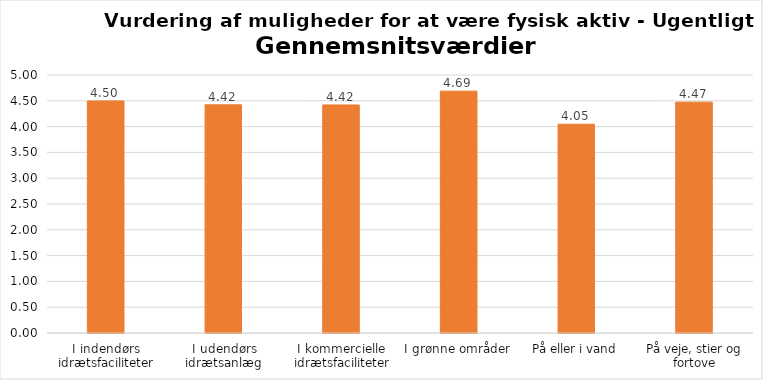
| Category | Gennemsnit |
|---|---|
| I indendørs idrætsfaciliteter | 4.497 |
| I udendørs idrætsanlæg | 4.423 |
| I kommercielle idrætsfaciliteter | 4.42 |
| I grønne områder | 4.687 |
| På eller i vand | 4.046 |
| På veje, stier og fortove | 4.474 |